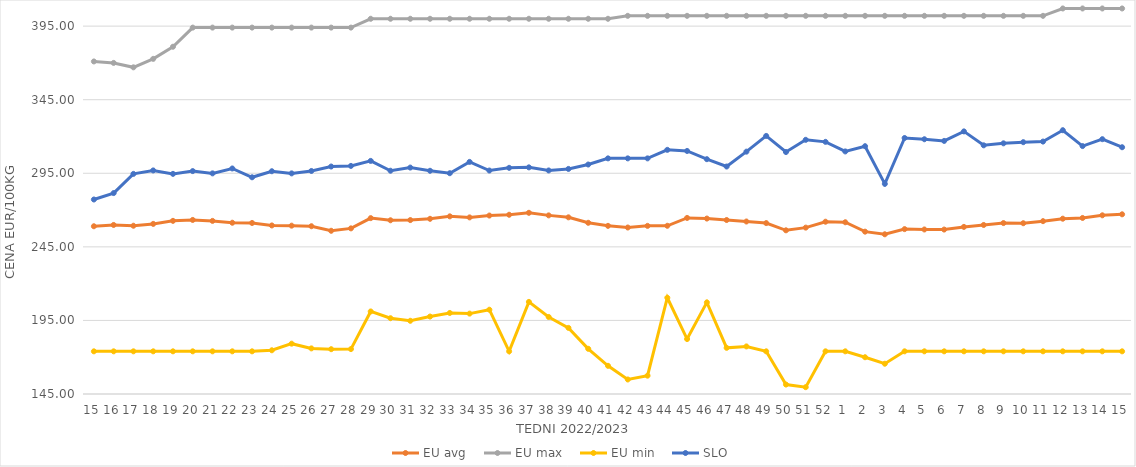
| Category | EU avg | EU max | EU min | SLO |
|---|---|---|---|---|
| 15.0 | 259 | 371 | 174 | 277.18 |
| 16.0 | 259.873 | 370 | 174 | 281.55 |
| 17.0 | 259.351 | 367 | 174 | 294.59 |
| 18.0 | 260.6 | 372.758 | 174 | 296.93 |
| 19.0 | 262.669 | 381 | 174 | 294.6 |
| 20.0 | 263.291 | 394 | 174 | 296.48 |
| 21.0 | 262.64 | 394 | 174 | 294.94 |
| 22.0 | 261.388 | 394 | 174 | 298.26 |
| 23.0 | 261.228 | 394 | 174 | 292.27 |
| 24.0 | 259.544 | 394 | 174.72 | 296.39 |
| 25.0 | 259.395 | 394 | 179.2 | 294.93 |
| 26.0 | 259.018 | 394 | 176 | 296.56 |
| 27.0 | 255.922 | 394 | 175.451 | 299.59 |
| 28.0 | 257.564 | 394 | 175.52 | 300.01 |
| 29.0 | 264.52 | 400 | 201.097 | 303.41 |
| 30.0 | 263.067 | 400 | 196.496 | 296.73 |
| 31.0 | 263.196 | 400 | 194.756 | 298.88 |
| 32.0 | 264.059 | 400 | 197.634 | 296.7 |
| 33.0 | 265.729 | 400 | 200.07 | 295.05 |
| 34.0 | 265.016 | 400 | 199.637 | 302.73 |
| 35.0 | 266.273 | 400 | 202.277 | 296.86 |
| 36.0 | 266.807 | 400 | 174 | 298.7 |
| 37.0 | 268.136 | 400 | 207.594 | 299.02 |
| 38.0 | 266.39 | 400 | 197.352 | 296.91 |
| 39.0 | 265.059 | 400 | 189.926 | 297.96 |
| 40.0 | 261.35 | 400 | 175.723 | 300.95 |
| 41.0 | 259.271 | 400 | 164.165 | 305.13 |
| 42.0 | 258.146 | 402 | 154.869 | 305.13 |
| 43.0 | 259.256 | 402 | 157.459 | 305.13 |
| 44.0 | 259.32 | 402 | 210.415 | 310.93 |
| 45.0 | 264.649 | 402 | 182.35 | 310.16 |
| 46.0 | 264.228 | 402 | 207.247 | 304.58 |
| 47.0 | 263.24 | 402 | 176.378 | 299.59 |
| 48.0 | 262.225 | 402 | 177.332 | 309.69 |
| 49.0 | 261.152 | 402 | 174 | 320.38 |
| 50.0 | 256.24 | 402 | 151.434 | 309.44 |
| 51.0 | 258.071 | 402 | 149.638 | 317.74 |
| 52.0 | 262.088 | 402 | 174 | 316.36 |
| 1.0 | 261.716 | 402 | 174 | 309.84 |
| 2.0 | 255.331 | 402 | 169.983 | 313.4 |
| 3.0 | 253.546 | 402 | 165.574 | 287.81 |
| 4.0 | 257.051 | 402 | 174 | 318.98 |
| 5.0 | 256.808 | 402 | 174 | 318.13 |
| 6.0 | 256.75 | 402 | 174 | 316.99 |
| 7.0 | 258.565 | 402 | 174 | 323.47 |
| 8.0 | 259.872 | 402 | 174 | 314 |
| 9.0 | 261.164 | 402 | 174 | 315.35 |
| 10.0 | 261.06 | 402 | 174 | 316.13 |
| 11.0 | 262.46 | 402 | 174 | 316.55 |
| 12.0 | 264.133 | 407 | 174 | 324.27 |
| 13.0 | 264.634 | 407 | 174 | 313.49 |
| 14.0 | 266.437 | 407 | 174 | 318.17 |
| 15.0 | 267.115 | 407 | 174 | 312.7 |